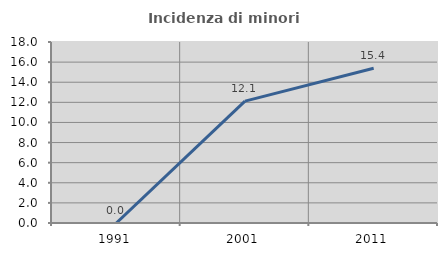
| Category | Incidenza di minori stranieri |
|---|---|
| 1991.0 | 0 |
| 2001.0 | 12.121 |
| 2011.0 | 15.385 |